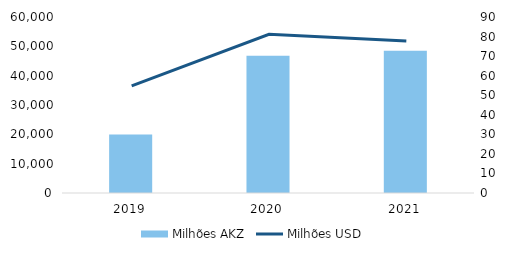
| Category | Milhões AKZ |
|---|---|
| 2019.0 | 19968 |
| 2020.0 | 46768 |
| 2021.0 | 48478 |